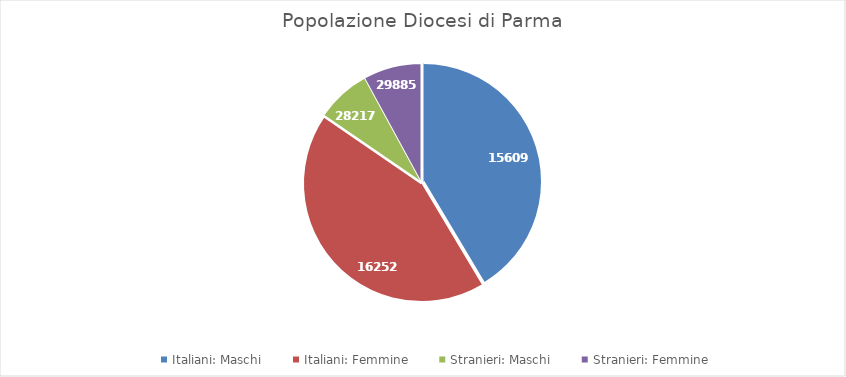
| Category | Series 0 |
|---|---|
| Italiani: Maschi | 156092 |
| Italiani: Femmine | 162527 |
| Stranieri: Maschi | 28217 |
| Stranieri: Femmine | 29885 |